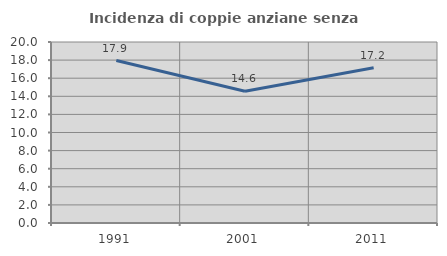
| Category | Incidenza di coppie anziane senza figli  |
|---|---|
| 1991.0 | 17.949 |
| 2001.0 | 14.563 |
| 2011.0 | 17.157 |